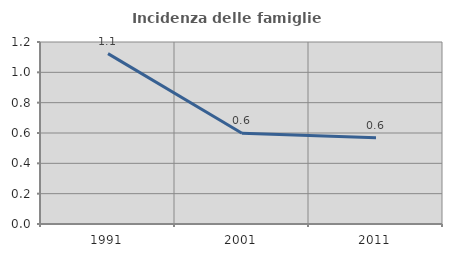
| Category | Incidenza delle famiglie numerose |
|---|---|
| 1991.0 | 1.124 |
| 2001.0 | 0.599 |
| 2011.0 | 0.568 |